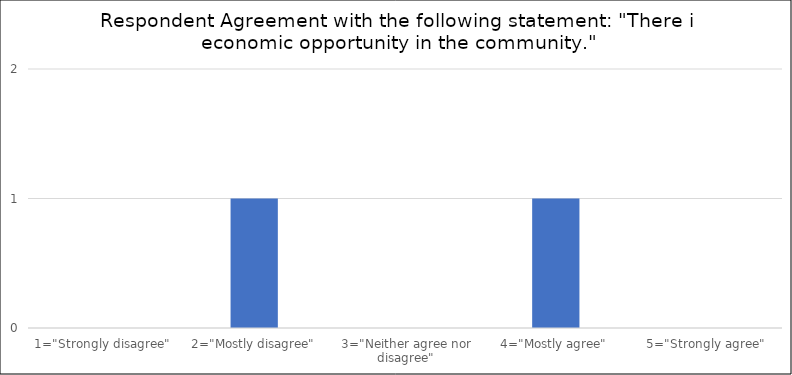
| Category | Number of Responses |
|---|---|
| 1="Strongly disagree" | 0 |
| 2="Mostly disagree" | 1 |
| 3="Neither agree nor disagree" | 0 |
| 4="Mostly agree" | 1 |
| 5="Strongly agree" | 0 |